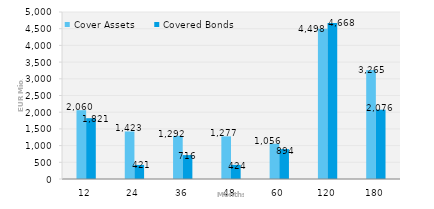
| Category | Cover Assets | Covered Bonds |
|---|---|---|
| 12.0 | 2060.024 | 1820.64 |
| 24.0 | 1423.26 | 421.415 |
| 36.0 | 1291.944 | 715.846 |
| 48.0 | 1276.612 | 423.5 |
| 60.0 | 1056.419 | 894.183 |
| 120.0 | 4497.776 | 4668.224 |
| 180.0 | 3264.852 | 2075.599 |